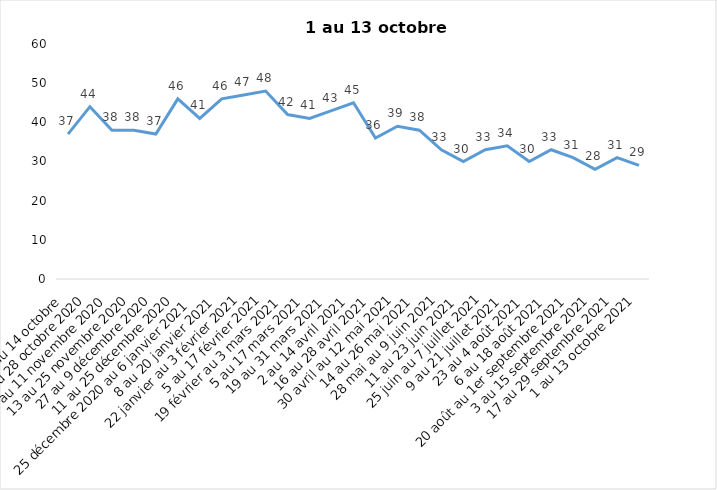
| Category | Toujours aux trois mesures |
|---|---|
| 2 au 14 octobre  | 37 |
| 16 au 28 octobre 2020 | 44 |
| 30 octobre au 11 novembre 2020 | 38 |
| 13 au 25 novembre 2020 | 38 |
| 27 au 9 décembre 2020 | 37 |
| 11 au 25 décembre 2020 | 46 |
| 25 décembre 2020 au 6 janvier 2021 | 41 |
| 8 au 20 janvier 2021 | 46 |
| 22 janvier au 3 février 2021 | 47 |
| 5 au 17 février 2021 | 48 |
| 19 février au 3 mars 2021 | 42 |
| 5 au 17 mars 2021 | 41 |
| 19 au 31 mars 2021 | 43 |
| 2 au 14 avril 2021 | 45 |
| 16 au 28 avril 2021 | 36 |
| 30 avril au 12 mai 2021 | 39 |
| 14 au 26 mai 2021 | 38 |
| 28 mai au 9 juin 2021 | 33 |
| 11 au 23 juin 2021 | 30 |
| 25 juin au 7 juillet 2021 | 33 |
| 9 au 21 juillet 2021 | 34 |
| 23 au 4 août 2021 | 30 |
| 6 au 18 août 2021 | 33 |
| 20 août au 1er septembre 2021 | 31 |
| 3 au 15 septembre 2021 | 28 |
| 17 au 29 septembre 2021 | 31 |
| 1 au 13 octobre 2021 | 29 |